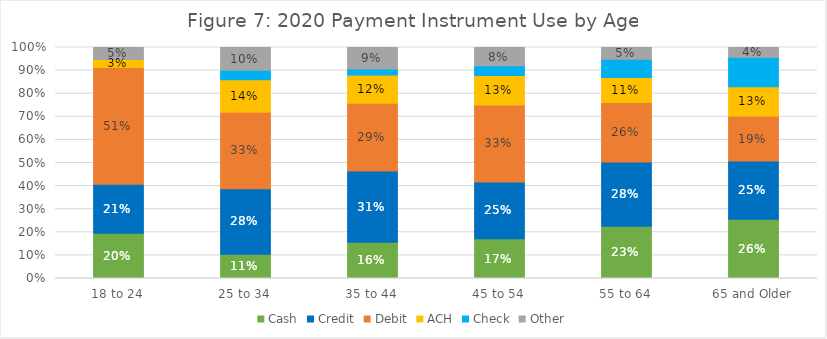
| Category | Cash | Credit | Debit | ACH | Check | Other |
|---|---|---|---|---|---|---|
| 18 to 24 | 0.195 | 0.213 | 0.506 | 0.034 | 0 | 0.052 |
| 25 to 34 | 0.105 | 0.283 | 0.331 | 0.14 | 0.041 | 0.099 |
| 35 to 44 | 0.157 | 0.308 | 0.294 | 0.122 | 0.026 | 0.093 |
| 45 to 54 | 0.172 | 0.246 | 0.333 | 0.127 | 0.042 | 0.079 |
| 55 to 64 | 0.227 | 0.278 | 0.258 | 0.108 | 0.079 | 0.051 |
| 65 and Older | 0.257 | 0.252 | 0.195 | 0.127 | 0.127 | 0.042 |